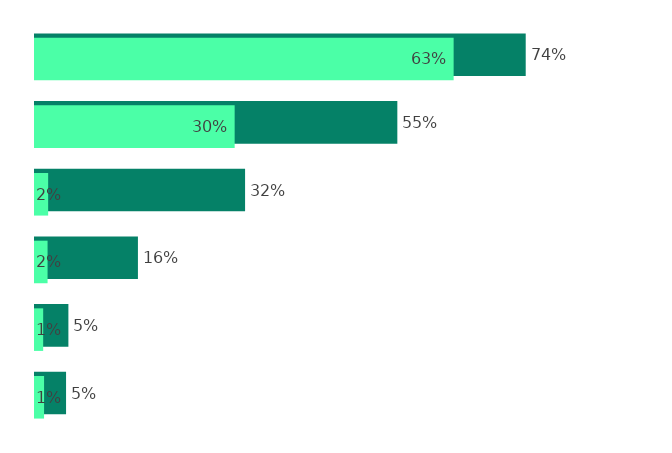
| Category | Series 0 | Series 1 |
|---|---|---|
| Interenchères.com | 74.21 | 63.31 |
| Drouotonline .com | 54.795 | 30.194 |
| Auction.fr | 31.77 | 1.989 |
| Invaluable.com | 15.566 | 1.9 |
| Moniteurlive.com | 5.05 | 1.236 |
| Autre | 4.697 | 1.371 |